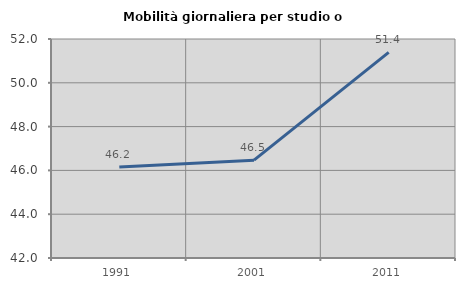
| Category | Mobilità giornaliera per studio o lavoro |
|---|---|
| 1991.0 | 46.154 |
| 2001.0 | 46.468 |
| 2011.0 | 51.386 |